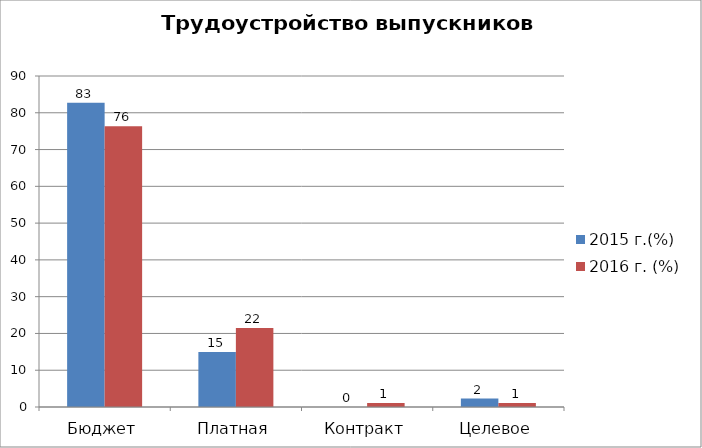
| Category | 2015 г.(%) | 2016 г. (%) |
|---|---|---|
| Бюджет | 82.759 | 76.344 |
| Платная | 14.943 | 21.505 |
| Контракт | 0 | 1.075 |
| Целевое | 2.299 | 1.075 |